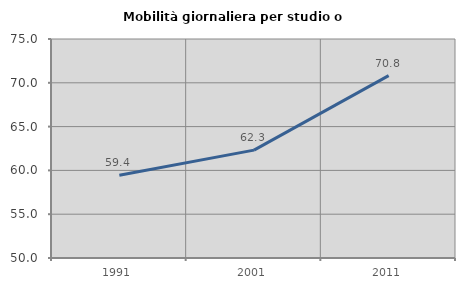
| Category | Mobilità giornaliera per studio o lavoro |
|---|---|
| 1991.0 | 59.438 |
| 2001.0 | 62.316 |
| 2011.0 | 70.818 |